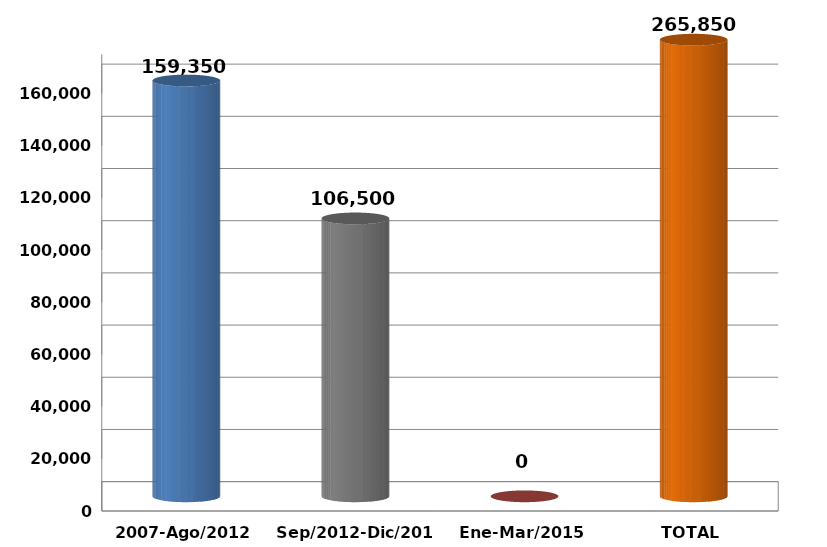
| Category | Series 0 |
|---|---|
| 2007-Ago/2012 | 159350 |
| Sep/2012-Dic/2014 | 106500 |
| Ene-Mar/2015 | 0 |
| TOTAL | 265850 |